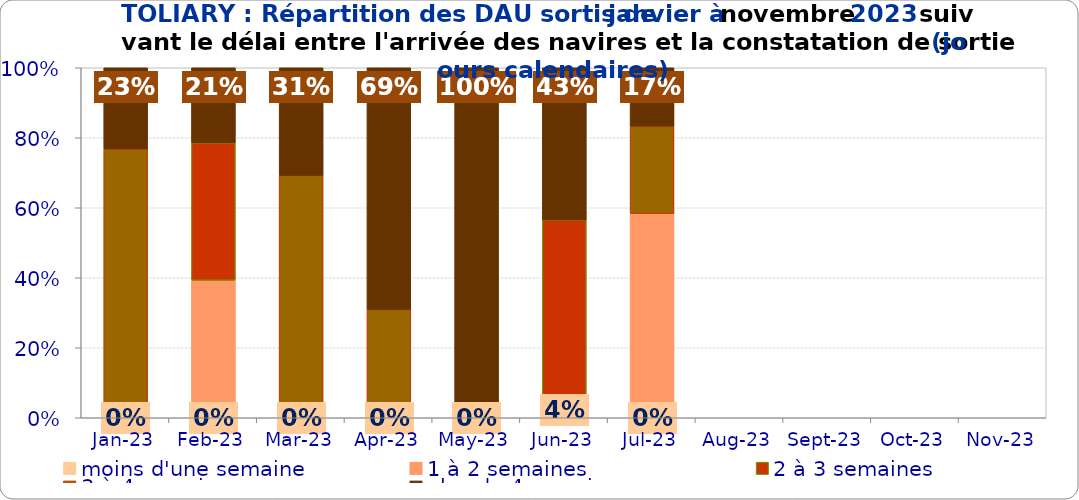
| Category | moins d'une semaine | 1 à 2 semaines | 2 à 3 semaines | 3 à 4 semaines | plus de 4 semaines |
|---|---|---|---|---|---|
| 2023-01-01 | 0 | 0 | 0 | 0.768 | 0.232 |
| 2023-02-01 | 0 | 0.393 | 0.393 | 0 | 0.214 |
| 2023-03-01 | 0 | 0.038 | 0 | 0.654 | 0.308 |
| 2023-04-01 | 0 | 0 | 0 | 0.31 | 0.69 |
| 2023-05-01 | 0 | 0 | 0 | 0 | 1 |
| 2023-06-01 | 0.043 | 0 | 0.522 | 0 | 0.435 |
| 2023-07-01 | 0 | 0.583 | 0 | 0.25 | 0.167 |
| 2023-08-01 | 0 | 0 | 0 | 0 | 0 |
| 2023-09-01 | 0 | 0 | 0 | 0 | 0 |
| 2023-10-01 | 0 | 0 | 0 | 0 | 0 |
| 2023-11-01 | 0 | 0 | 0 | 0 | 0 |